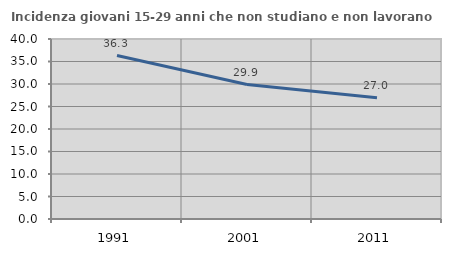
| Category | Incidenza giovani 15-29 anni che non studiano e non lavorano  |
|---|---|
| 1991.0 | 36.325 |
| 2001.0 | 29.877 |
| 2011.0 | 26.962 |